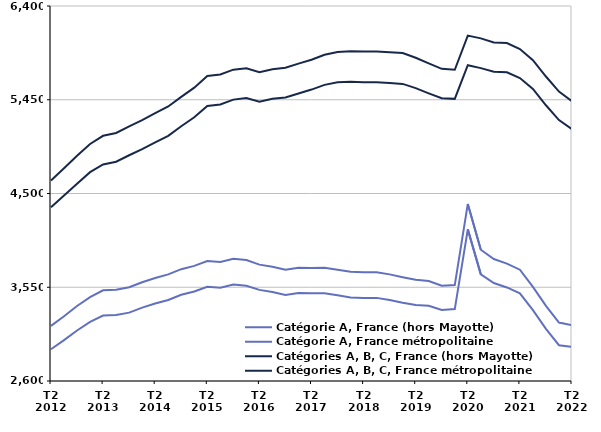
| Category | Catégorie A, France (hors Mayotte) | Catégorie A, France métropolitaine | Catégories A, B, C, France (hors Mayotte) | Catégories A, B, C, France métropolitaine |
|---|---|---|---|---|
| T2
2012 | 3159 | 2921.5 | 4631.5 | 4361.6 |
| T3
2012 | 3256.7 | 3014.6 | 4755.6 | 4480 |
| T4
2012 | 3360.1 | 3112.1 | 4881.7 | 4599.7 |
| T1
2013 | 3450.5 | 3199.3 | 5002.3 | 4716.5 |
| T2
2013 | 3519.4 | 3263.5 | 5084.8 | 4794 |
| T3
2013 | 3525.6 | 3269.5 | 5113.2 | 4822.1 |
| T4
2013 | 3549.6 | 3292.6 | 5180.4 | 4887.5 |
| T1
2014 | 3600.3 | 3343.8 | 5242.6 | 4949.4 |
| T2
2014 | 3643.8 | 3385.7 | 5314 | 5018.7 |
| T3
2014 | 3680.3 | 3421.1 | 5381.5 | 5084.6 |
| T4
2014 | 3733 | 3473.8 | 5479.6 | 5181.7 |
| T1
2015 | 3766.4 | 3506.3 | 5572.6 | 5273.1 |
| T2
2015 | 3816.5 | 3554.1 | 5691.3 | 5387.7 |
| T3
2015 | 3807 | 3545.1 | 5706.6 | 5402.5 |
| T4
2015 | 3837.8 | 3577.3 | 5754.8 | 5451.4 |
| T1
2016 | 3825.5 | 3565.5 | 5769.9 | 5466.5 |
| T2
2016 | 3779.2 | 3523.4 | 5730 | 5430.8 |
| T3
2016 | 3757.5 | 3501.9 | 5760 | 5460.1 |
| T4
2016 | 3727.7 | 3471.4 | 5773.5 | 5472.1 |
| T1
2017 | 3747.7 | 3490.5 | 5816.2 | 5513.8 |
| T2
2017 | 3744.5 | 3488.6 | 5855.6 | 5553.2 |
| T3
2017 | 3746.7 | 3489.7 | 5905.6 | 5600.8 |
| T4
2017 | 3727.1 | 3467.9 | 5934.8 | 5626.4 |
| T1
2018 | 3706.9 | 3446.5 | 5941.8 | 5631.4 |
| T2
2018 | 3703 | 3442.2 | 5939.3 | 5626.8 |
| T3
2018 | 3702.6 | 3442.3 | 5939.2 | 5626.8 |
| T4
2018 | 3680.6 | 3421.6 | 5930.7 | 5619 |
| T1
2019 | 3651.8 | 3393.7 | 5922.7 | 5610.7 |
| T2
2019 | 3625.1 | 3370.5 | 5875.5 | 5567.6 |
| T3
2019 | 3612.9 | 3361.8 | 5818.5 | 5514.6 |
| T4
2019 | 3564.9 | 3319 | 5763.1 | 5464.7 |
| T1
2020 | 3572.1 | 3328.5 | 5753.9 | 5459 |
| T2
2020 | 4394.2 | 4136.7 | 6100.6 | 5800.5 |
| T3
2020 | 3930.3 | 3680.5 | 6071.8 | 5770.7 |
| T4
2020 | 3836.3 | 3593.3 | 6030.4 | 5733.6 |
| T1
2021 | 3789.3 | 3548 | 6024.7 | 5727.8 |
| T2
2021 | 3727.7 | 3488.9 | 5964.2 | 5669.7 |
| T3
2021 | 3553 | 3317.3 | 5851.5 | 5559.2 |
| T4
2021 | 3361.9 | 3127.5 | 5685.4 | 5394.2 |
| T1
2022 | 3192.8 | 2962.8 | 5532.7 | 5244.2 |
| T2
2022 | 3165.9 | 2944.7 | 5436.1 | 5152.1 |